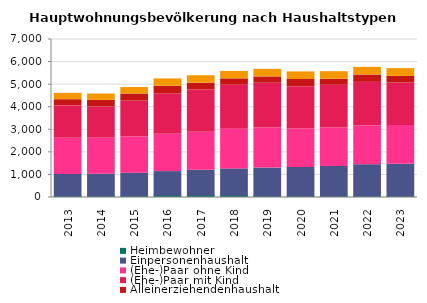
| Category | Heimbewohner | Einpersonenhaushalt | (Ehe-)Paar ohne Kind | (Ehe-)Paar mit Kind | Alleinerziehendenhaushalt | sonstiger Mehrpersonenhaushalt |
|---|---|---|---|---|---|---|
| 2013.0 | 65 | 953 | 1610 | 1442 | 263 | 281 |
| 2014.0 | 71 | 962 | 1598 | 1379 | 293 | 281 |
| 2015.0 | 74 | 1004 | 1604 | 1586 | 317 | 287 |
| 2016.0 | 104 | 1043 | 1655 | 1781 | 344 | 326 |
| 2017.0 | 101 | 1109 | 1685 | 1868 | 299 | 332 |
| 2018.0 | 101 | 1166 | 1760 | 1952 | 278 | 329 |
| 2019.0 | 65 | 1241 | 1769 | 1988 | 278 | 338 |
| 2020.0 | 53 | 1277 | 1706 | 1874 | 317 | 338 |
| 2021.0 | 62 | 1316 | 1706 | 1889 | 269 | 332 |
| 2022.0 | 59 | 1394 | 1718 | 1931 | 323 | 341 |
| 2023.0 | 59 | 1418 | 1715 | 1874 | 299 | 344 |